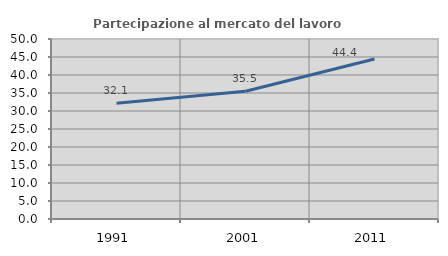
| Category | Partecipazione al mercato del lavoro  femminile |
|---|---|
| 1991.0 | 32.143 |
| 2001.0 | 35.484 |
| 2011.0 | 44.444 |